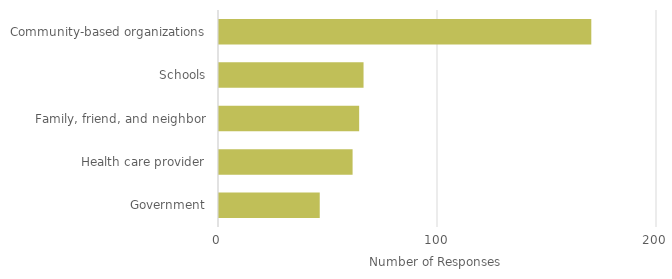
| Category | Series 0 |
|---|---|
| Government | 46 |
| Health care provider | 61 |
| Family, friend, and neighbor | 64 |
| Schools | 66 |
| Community-based organizations | 170 |